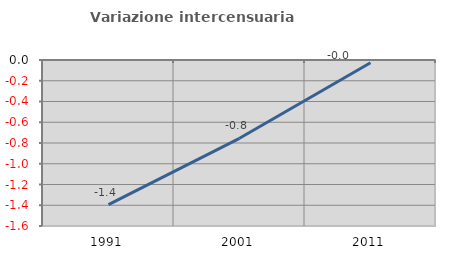
| Category | Variazione intercensuaria annua |
|---|---|
| 1991.0 | -1.394 |
| 2001.0 | -0.755 |
| 2011.0 | -0.026 |